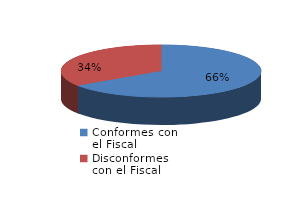
| Category | Series 0 |
|---|---|
| 0 | 604 |
| 1 | 318 |